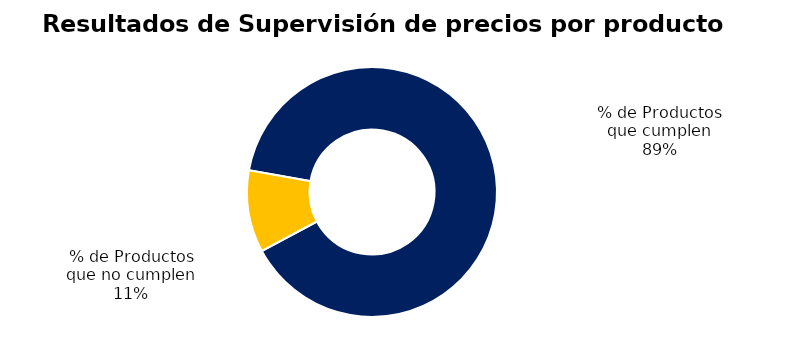
| Category | Series 0 |
|---|---|
| % de Productos que cumplen | 312 |
| % de Productos que no cumplen | 37 |